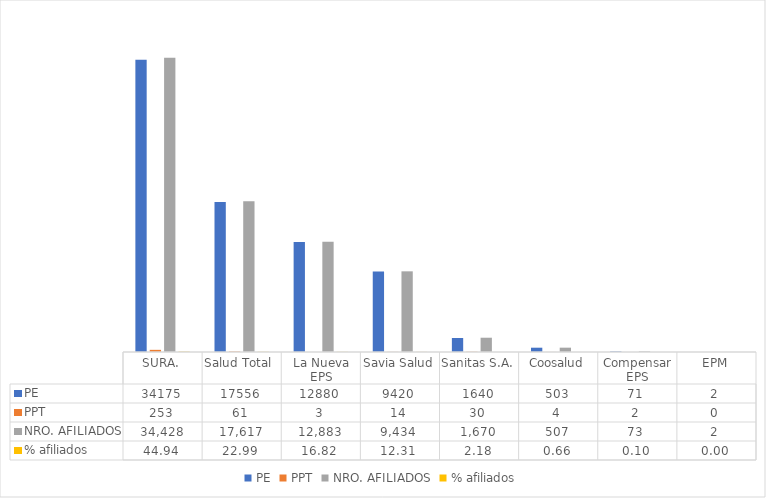
| Category | PE | PPT | NRO. AFILIADOS | % afiliados |
|---|---|---|---|---|
| SURA. | 34175 | 253 | 34428 | 44.936 |
| Salud Total  | 17556 | 61 | 17617 | 22.994 |
| La Nueva EPS | 12880 | 3 | 12883 | 16.815 |
| Savia Salud | 9420 | 14 | 9434 | 12.314 |
| Sanitas S.A. | 1640 | 30 | 1670 | 2.18 |
| Coosalud | 503 | 4 | 507 | 0.662 |
| Compensar EPS | 71 | 2 | 73 | 0.095 |
| EPM | 2 | 0 | 2 | 0.003 |